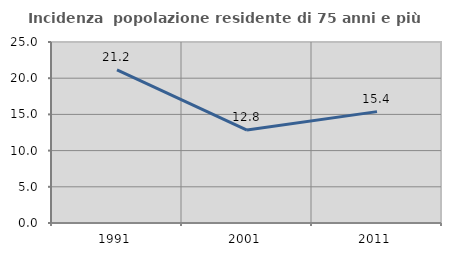
| Category | Incidenza  popolazione residente di 75 anni e più |
|---|---|
| 1991.0 | 21.164 |
| 2001.0 | 12.832 |
| 2011.0 | 15.385 |